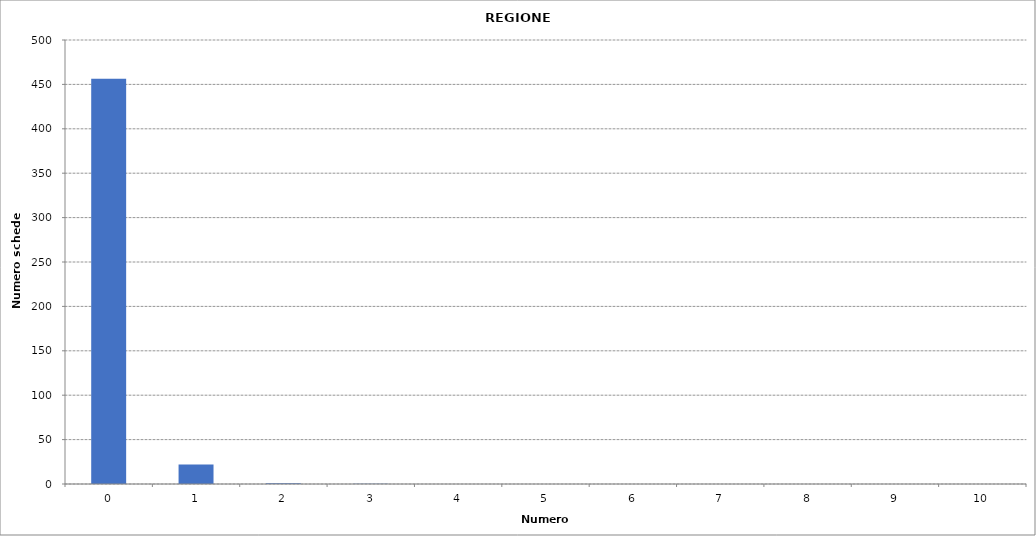
| Category | Series 0 |
|---|---|
| 0.0 | 456483 |
| 1.0 | 21954 |
| 2.0 | 813 |
| 3.0 | 244 |
| 4.0 | 39 |
| 5.0 | 5 |
| 6.0 | 3 |
| 7.0 | 2 |
| 8.0 | 1 |
| 9.0 | 1 |
| 10.0 | 2 |